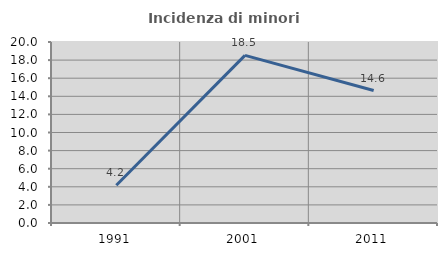
| Category | Incidenza di minori stranieri |
|---|---|
| 1991.0 | 4.167 |
| 2001.0 | 18.519 |
| 2011.0 | 14.634 |